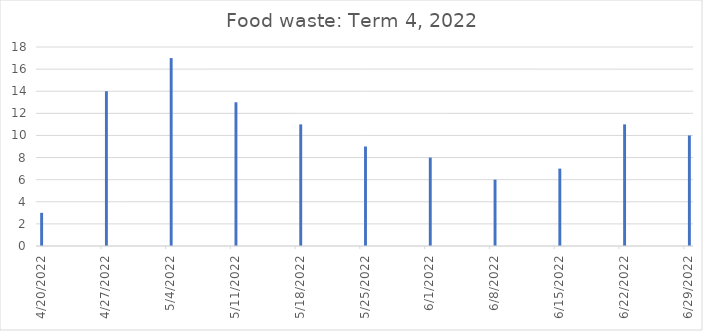
| Category | Series 0 |
|---|---|
| 4/20/22 | 3 |
| 4/27/22 | 14 |
| 5/4/22 | 17 |
| 5/11/22 | 13 |
| 5/18/22 | 11 |
| 5/25/22 | 9 |
| 6/1/22 | 8 |
| 6/8/22 | 6 |
| 6/15/22 | 7 |
| 6/22/22 | 11 |
| 6/29/22 | 10 |